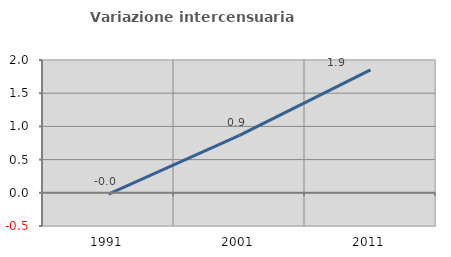
| Category | Variazione intercensuaria annua |
|---|---|
| 1991.0 | -0.02 |
| 2001.0 | 0.864 |
| 2011.0 | 1.851 |